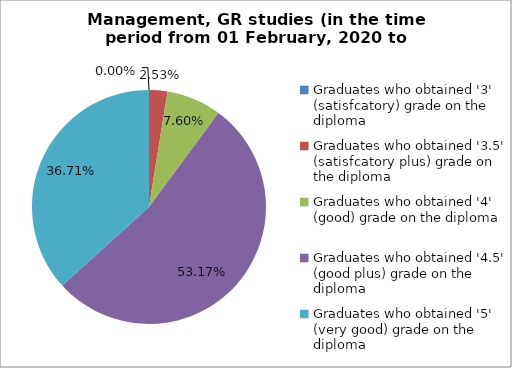
| Category | Series 0 |
|---|---|
| Graduates who obtained '3' (satisfcatory) grade on the diploma | 0 |
| Graduates who obtained '3.5' (satisfcatory plus) grade on the diploma | 2.532 |
| Graduates who obtained '4' (good) grade on the diploma | 7.595 |
| Graduates who obtained '4.5' (good plus) grade on the diploma | 53.165 |
| Graduates who obtained '5' (very good) grade on the diploma | 36.709 |